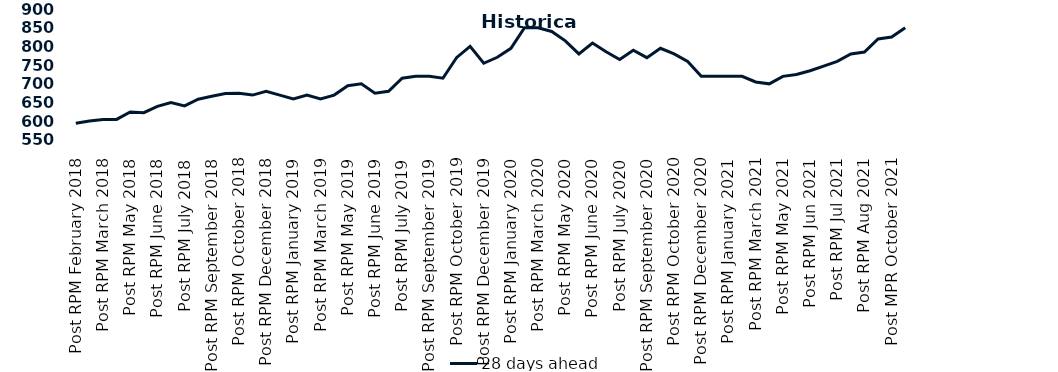
| Category | 28 days ahead |
|---|---|
| Post RPM February 2018 | 595 |
| Pre RPM March 2018 | 601 |
| Post RPM March 2018 | 605 |
| Pre RPM May 2018 | 605 |
| Post RPM May 2018 | 625 |
| Pre RPM June 2018 | 623 |
| Post RPM June 2018 | 640 |
| Pre RPM July 2018 | 650 |
| Post RPM July 2018 | 641 |
| Pre RPM September 2018 | 659 |
| Post RPM September 2018 | 666.75 |
| Pre RPM October 2018 | 674 |
| Post RPM October 2018 | 675 |
| Pre RPM December 2018 | 670 |
| Post RPM December 2018 | 680 |
| Pre RPM January 2019 | 670 |
| Post RPM January 2019 | 660 |
| Pre RPM March 2019 | 670 |
| Post RPM March 2019 | 660 |
| Pre RPM May 2019 | 670 |
| Post RPM May 2019 | 695 |
| Pre RPM June 2019 | 700 |
| Post RPM June 2019 | 675 |
| Pre RPM July 2019 | 680 |
| Post RPM July 2019 | 715 |
| Pre RPM September 2019 | 720 |
| Post RPM September 2019 | 720 |
| Pre RPM October 2019 | 715 |
| Post RPM October 2019 | 770 |
| Pre RPM December 2019 | 800 |
| Post RPM December 2019 | 755 |
| Pre RPM January 2020 | 771 |
| Post RPM January 2020 | 795 |
| Pre RPM March 2020 | 850 |
| Post RPM March 2020 | 850 |
| Pre RPM May 2020 | 840 |
| Post RPM May 2020 | 815 |
| Pre RPM June 2020 | 780 |
| Post RPM June 2020 | 809 |
| Pre RPM July 2020 | 785.72 |
| Post RPM July 2020 | 765 |
| Pre RPM September 2020 | 790 |
| Post RPM September 2020 | 770 |
| Pre RPM October 2020 | 795 |
| Post RPM October 2020 | 780 |
| Pre RPM December 2020 | 760 |
|  Post RPM December 2020 | 720 |
| Pre RPM January 2021 | 720 |
| Post RPM January 2021 | 720 |
|  Pre RPM March 2021 | 720 |
|  Post RPM March 2021 | 705 |
|  Pre RPM May 2021 | 700 |
|  Post RPM May 2021 | 720 |
|  Pre RPM Jun 2021 | 725 |
|   Post RPM Jun 2021 | 735 |
| Pre RPM Jul 2021 | 747.5 |
|  Post RPM Jul 2021 | 760 |
| Pre RPM Aug 2021 | 780 |
|  Post RPM Aug 2021 | 785 |
| Pre MPR October 2021 | 820 |
| Post MPR October 2021 | 825 |
| Pre MPR December 2021 | 850 |